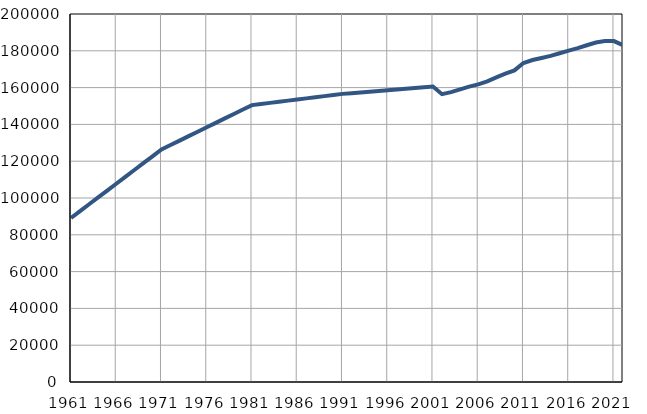
| Category | Број
становника |
|---|---|
| 1961.0 | 89141 |
| 1962.0 | 92865 |
| 1963.0 | 96589 |
| 1964.0 | 100313 |
| 1965.0 | 104037 |
| 1966.0 | 107760 |
| 1967.0 | 111484 |
| 1968.0 | 115208 |
| 1969.0 | 118932 |
| 1970.0 | 122656 |
| 1971.0 | 126380 |
| 1972.0 | 128790 |
| 1973.0 | 131201 |
| 1974.0 | 133611 |
| 1975.0 | 136022 |
| 1976.0 | 138432 |
| 1977.0 | 140842 |
| 1978.0 | 143253 |
| 1979.0 | 145663 |
| 1980.0 | 148074 |
| 1981.0 | 150484 |
| 1982.0 | 151094 |
| 1983.0 | 151705 |
| 1984.0 | 152315 |
| 1985.0 | 152925 |
| 1986.0 | 153535 |
| 1987.0 | 154146 |
| 1988.0 | 154756 |
| 1989.0 | 155366 |
| 1990.0 | 155977 |
| 1991.0 | 156587 |
| 1992.0 | 156988 |
| 1993.0 | 157389 |
| 1994.0 | 157791 |
| 1995.0 | 158191 |
| 1996.0 | 158592 |
| 1997.0 | 158994 |
| 1998.0 | 159395 |
| 1999.0 | 159796 |
| 2000.0 | 160197 |
| 2001.0 | 160598 |
| 2002.0 | 156438 |
| 2003.0 | 157528 |
| 2004.0 | 159047 |
| 2005.0 | 160542 |
| 2006.0 | 161753 |
| 2007.0 | 163382 |
| 2008.0 | 165539 |
| 2009.0 | 167559 |
| 2010.0 | 169355 |
| 2011.0 | 173347 |
| 2012.0 | 174973 |
| 2013.0 | 176113 |
| 2014.0 | 177258 |
| 2015.0 | 178670 |
| 2016.0 | 180081 |
| 2017.0 | 181414 |
| 2018.0 | 183003 |
| 2019.0 | 184488 |
| 2020.0 | 185262 |
| 2021.0 | 185270 |
| 2022.0 | 183002 |